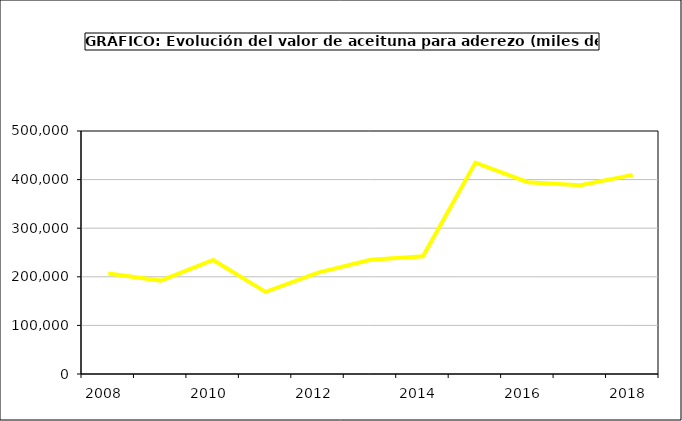
| Category | producción |
|---|---|
| 2008.0 | 207000.08 |
| 2009.0 | 192222.48 |
| 2010.0 | 234593.447 |
| 2011.0 | 168933.753 |
| 2012.0 | 208668.687 |
| 2013.0 | 235213.576 |
| 2014.0 | 242272.525 |
| 2015.0 | 434946 |
| 2016.0 | 394686 |
| 2017.0 | 388313.865 |
| 2018.0 | 409725.361 |